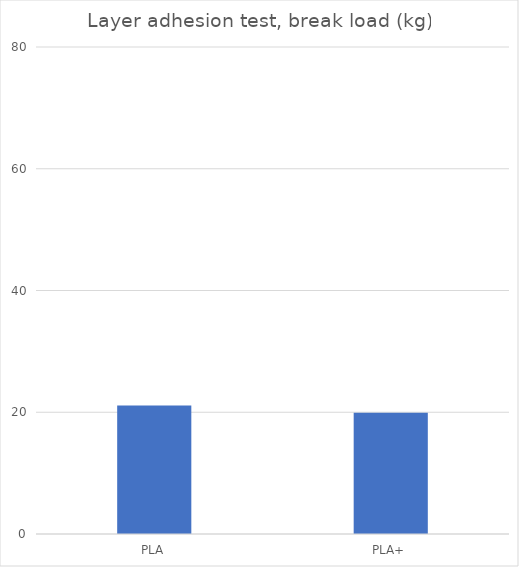
| Category | Average |
|---|---|
| PLA | 21.1 |
| PLA+ | 19.9 |